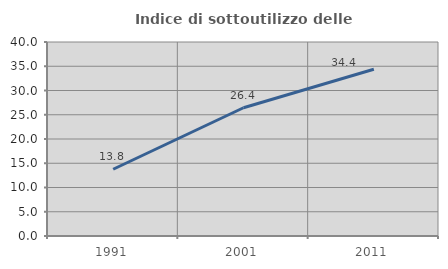
| Category | Indice di sottoutilizzo delle abitazioni  |
|---|---|
| 1991.0 | 13.767 |
| 2001.0 | 26.441 |
| 2011.0 | 34.392 |